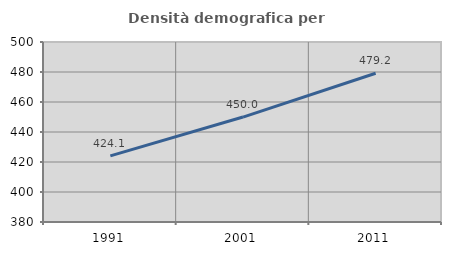
| Category | Densità demografica |
|---|---|
| 1991.0 | 424.09 |
| 2001.0 | 449.96 |
| 2011.0 | 479.19 |